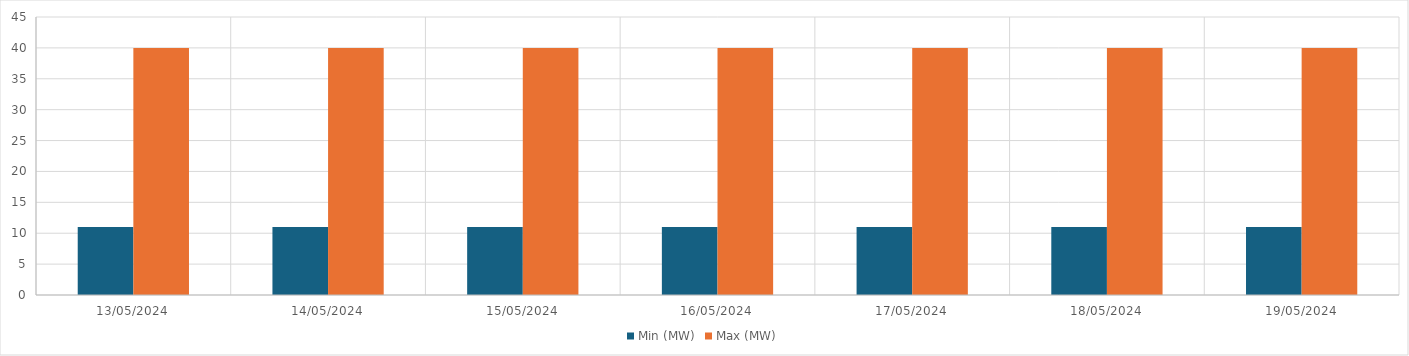
| Category | Min (MW) | Max (MW) |
|---|---|---|
| 13/05/2024 | 11 | 40 |
| 14/05/2024 | 11 | 40 |
| 15/05/2024 | 11 | 40 |
| 16/05/2024 | 11 | 40 |
| 17/05/2024 | 11 | 40 |
| 18/05/2024 | 11 | 40 |
| 19/05/2024 | 11 | 40 |